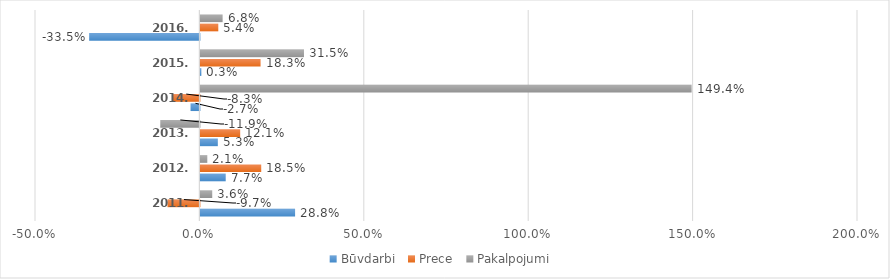
| Category | Būvdarbi | Prece | Pakalpojumi |
|---|---|---|---|
| 2011. gads | 0.288 | -0.097 | 0.036 |
| 2012. gads | 0.077 | 0.185 | 0.021 |
| 2013. gads | 0.053 | 0.121 | -0.119 |
| 2014. gads | -0.027 | -0.083 | 1.494 |
| 2015. gads | 0.003 | 0.183 | 0.315 |
| 2016. gads | -0.335 | 0.054 | 0.068 |